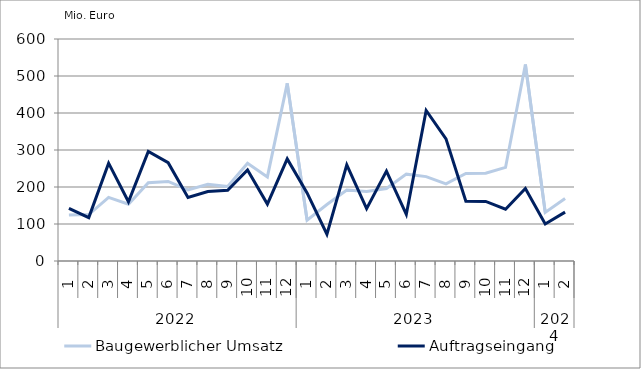
| Category | Baugewerblicher Umsatz | Auftragseingang |
|---|---|---|
| 0 | 124217.549 | 142351.759 |
| 1 | 125619.696 | 117194.423 |
| 2 | 171896.664 | 264509.013 |
| 3 | 153384.654 | 160146.519 |
| 4 | 211335.38 | 295997.826 |
| 5 | 214914.164 | 265813.917 |
| 6 | 192047.613 | 171529.517 |
| 7 | 207577.681 | 187809.656 |
| 8 | 201109.781 | 190941.096 |
| 9 | 264135.048 | 246250.021 |
| 10 | 227299.047 | 153783.993 |
| 11 | 480026.589 | 276019.328 |
| 12 | 110408.991 | 184068.731 |
| 13 | 152702.87 | 72330.186 |
| 14 | 191677.032 | 259741.102 |
| 15 | 187876.702 | 141464.389 |
| 16 | 195815.34 | 243069.898 |
| 17 | 234759.067 | 125882.939 |
| 18 | 228043.08 | 406932.293 |
| 19 | 208510.786 | 330128.024 |
| 20 | 236511.503 | 161760.047 |
| 21 | 237275.194 | 161029.305 |
| 22 | 252921.567 | 139832.011 |
| 23 | 530955.69 | 196157.417 |
| 24 | 131309.627 | 99926.857 |
| 25 | 168746.368 | 132138.123 |